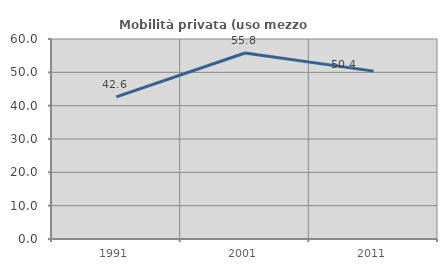
| Category | Mobilità privata (uso mezzo privato) |
|---|---|
| 1991.0 | 42.623 |
| 2001.0 | 55.805 |
| 2011.0 | 50.365 |